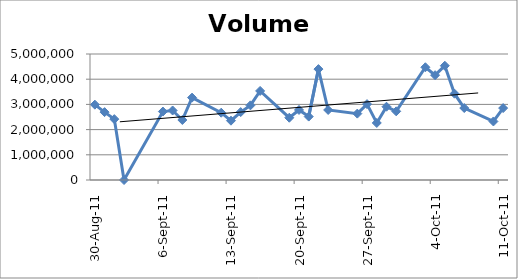
| Category | Volume |
|---|---|
| 2011-10-11 | 2853777 |
| 2011-10-10 | 2322903 |
| 2011-10-07 | 2856047 |
| 2011-10-06 | 3424623 |
| 2011-10-05 | 4534752 |
| 2011-10-04 | 4159130 |
| 2011-10-03 | 4473863 |
| 2011-09-30 | 2724908 |
| 2011-09-29 | 2907381 |
| 2011-09-28 | 2263403 |
| 2011-09-27 | 3010925 |
| 2011-09-26 | 2634234 |
| 2011-09-23 | 2778870 |
| 2011-09-22 | 4400586 |
| 2011-09-21 | 2516138 |
| 2011-09-20 | 2779078 |
| 2011-09-19 | 2471190 |
| 2011-09-16 | 3534779 |
| 2011-09-15 | 2961967 |
| 2011-09-14 | 2694739 |
| 2011-09-13 | 2354150 |
| 2011-09-12 | 2670471 |
| 2011-09-09 | 3269069 |
| 2011-09-08 | 2381025 |
| 2011-09-07 | 2758545 |
| 2011-09-06 | 2715977 |
| 2011-09-02 | 0 |
| 2011-09-01 | 2415607 |
| 2011-08-31 | 2693390 |
| 2011-08-30 | 2990176 |